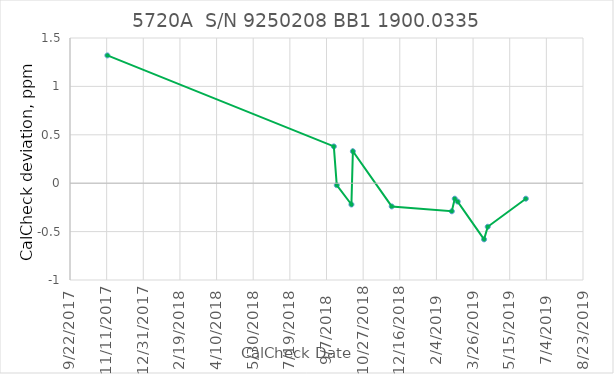
| Category | Series 0 |
|---|---|
| 43051.0 | 1.32 |
| 43360.0 | 0.38 |
| 43364.0 | -0.02 |
| 43384.0 | -0.22 |
| 43386.0 | 0.33 |
| 43439.0 | -0.24 |
| 43521.0 | -0.29 |
| 43525.0 | -0.16 |
| 43529.0 | -0.19 |
| 43565.0 | -0.58 |
| 43570.0 | -0.45 |
| 43622.0 | -0.16 |